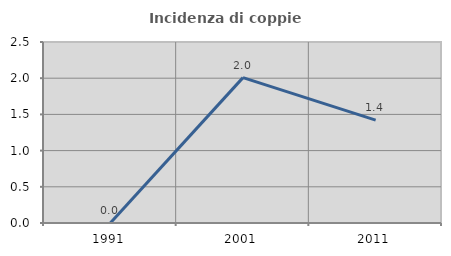
| Category | Incidenza di coppie miste |
|---|---|
| 1991.0 | 0 |
| 2001.0 | 2.008 |
| 2011.0 | 1.422 |